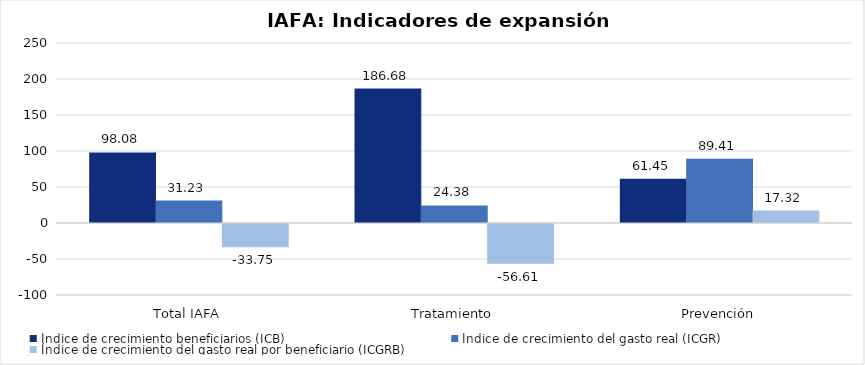
| Category | Índice de crecimiento beneficiarios (ICB)  | Índice de crecimiento del gasto real (ICGR)  | Índice de crecimiento del gasto real por beneficiario (ICGRB)  |
|---|---|---|---|
| Total IAFA | 98.083 | 31.228 | -33.751 |
| Tratamiento | 186.681 | 24.383 | -56.613 |
| Prevención | 61.451 | 89.408 | 17.316 |